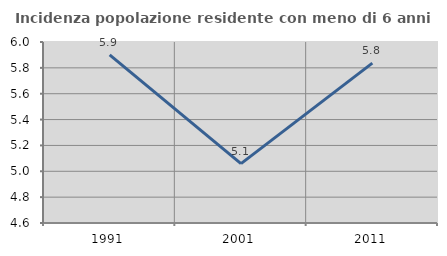
| Category | Incidenza popolazione residente con meno di 6 anni |
|---|---|
| 1991.0 | 5.9 |
| 2001.0 | 5.059 |
| 2011.0 | 5.837 |